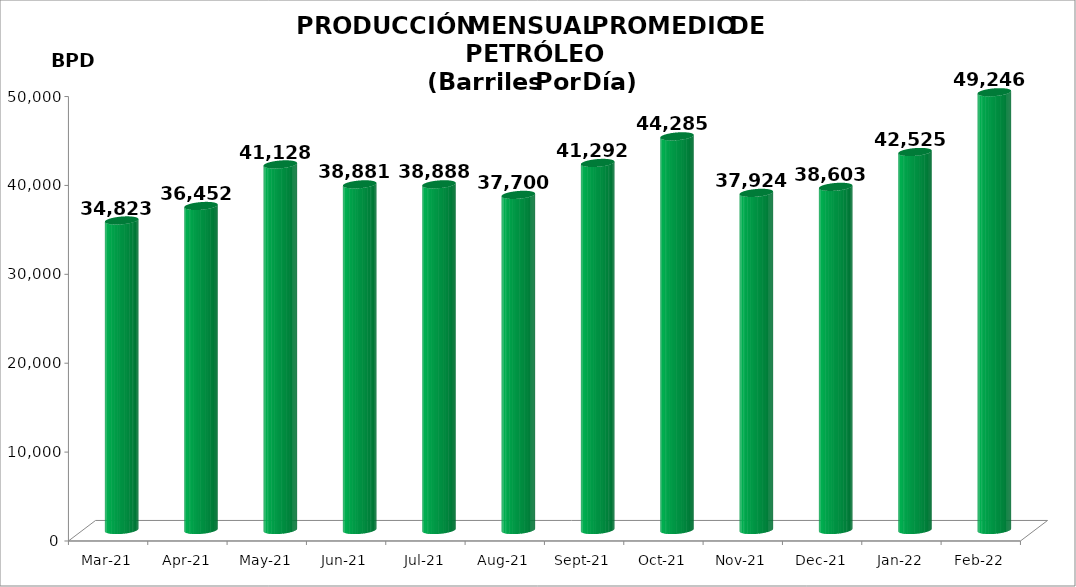
| Category | Series 0 |
|---|---|
| 2021-03-01 | 34823 |
| 2021-04-01 | 36452 |
| 2021-05-01 | 41128.032 |
| 2021-06-01 | 38881.4 |
| 2021-07-01 | 38887.645 |
| 2021-08-01 | 37699.645 |
| 2021-09-01 | 41292 |
| 2021-10-01 | 44285 |
| 2021-11-01 | 37924 |
| 2021-12-01 | 38603 |
| 2022-01-01 | 42524.516 |
| 2022-02-01 | 49246 |